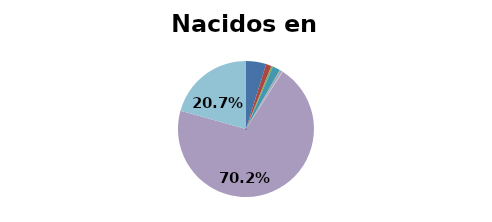
| Category | Nacidos en Colombia |
|---|---|
| Mapuche | 0.048 |
| Aymara | 0.013 |
| Rapa Nui | 0.004 |
| Lican Antai | 0 |
| Quechua | 0.018 |
| Colla | 0.001 |
| Diaguita | 0.005 |
| Kawésqar | 0.001 |
| Yagán o Yámana | 0.001 |
| Otro | 0.702 |
| Pueblo ignorado | 0.207 |